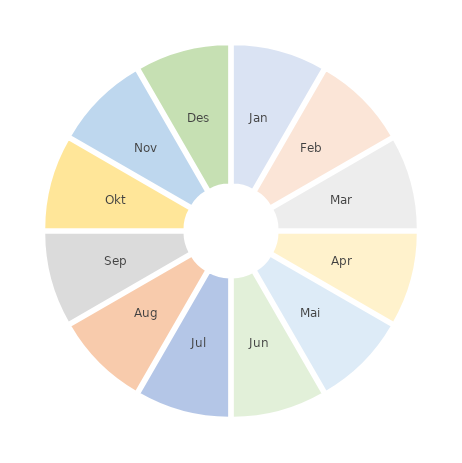
| Category | Series 0 |
|---|---|
| Jan | 1 |
| Feb | 1 |
| Mar | 1 |
| Apr | 1 |
| Mai | 1 |
| Jun | 1 |
| Jul | 1 |
| Aug | 1 |
| Sep | 1 |
| Okt | 1 |
| Nov | 1 |
| Des | 1 |